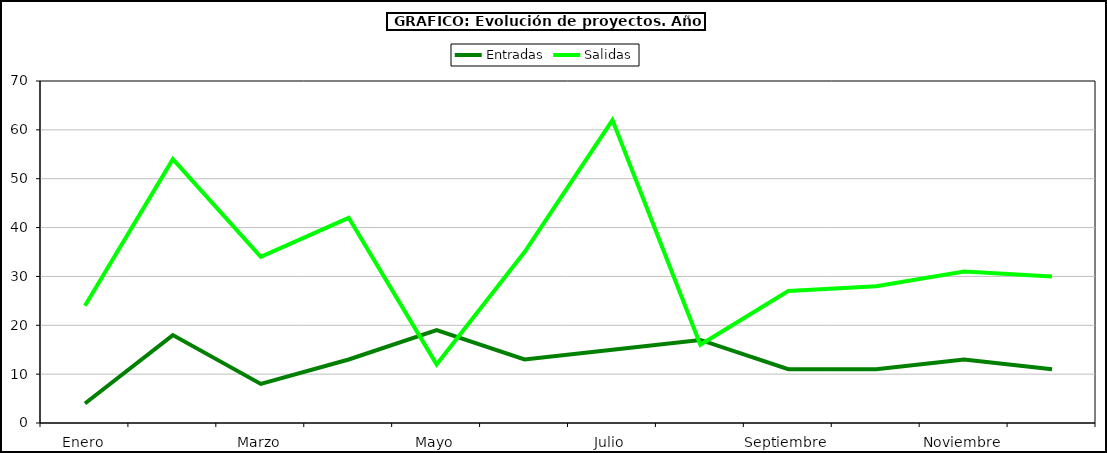
| Category | Entradas | Salidas |
|---|---|---|
| Enero | 4 | 24 |
| Febrero | 18 | 54 |
| Marzo | 8 | 34 |
| Abril | 13 | 42 |
| Mayo | 19 | 12 |
| Junio | 13 | 35 |
| Julio | 15 | 62 |
| Agosto | 17 | 16 |
| Septiembre | 11 | 27 |
| Octubre | 11 | 28 |
| Noviembre | 13 | 31 |
| Diciembre | 11 | 30 |